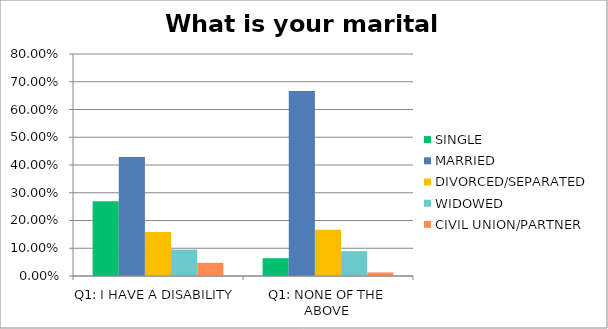
| Category | SINGLE | MARRIED | DIVORCED/SEPARATED | WIDOWED | CIVIL UNION/PARTNER |
|---|---|---|---|---|---|
| Q1: I HAVE A DISABILITY | 0.27 | 0.429 | 0.159 | 0.095 | 0.048 |
| Q1: NONE OF THE ABOVE | 0.064 | 0.667 | 0.167 | 0.09 | 0.013 |